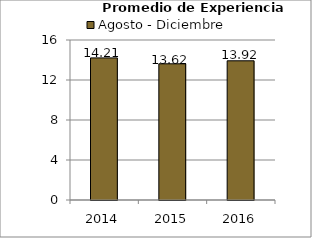
| Category | Agosto - Diciembre |
|---|---|
| 2014.0 | 14.21 |
| 2015.0 | 13.62 |
| 2016.0 | 13.92 |